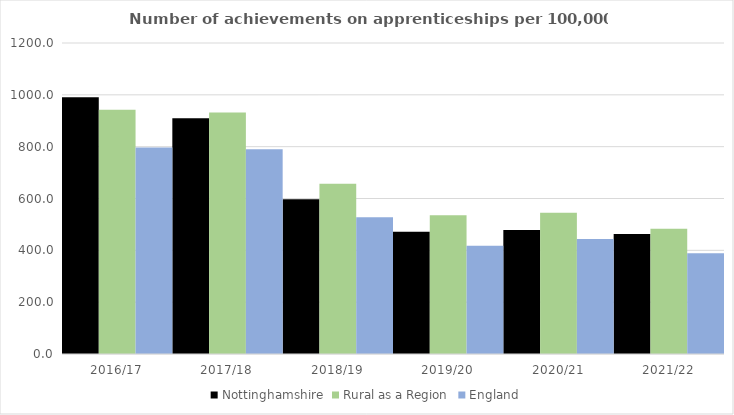
| Category | Nottinghamshire | Rural as a Region | England |
|---|---|---|---|
| 2016/17 | 990.618 | 942.594 | 797 |
| 2017/18 | 909.787 | 931.709 | 790 |
| 2018/19 | 596.749 | 656.44 | 528 |
| 2019/20 | 471.575 | 535.552 | 418 |
| 2020/21 | 478.093 | 545.333 | 444 |
| 2021/22 | 463.279 | 482.936 | 389 |